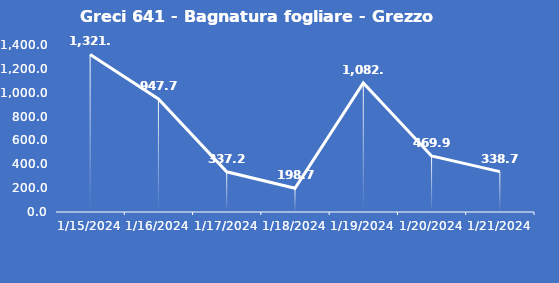
| Category | Greci 641 - Bagnatura fogliare - Grezzo (min) |
|---|---|
| 1/15/24 | 1321.2 |
| 1/16/24 | 947.7 |
| 1/17/24 | 337.2 |
| 1/18/24 | 198.7 |
| 1/19/24 | 1082.4 |
| 1/20/24 | 469.9 |
| 1/21/24 | 338.7 |